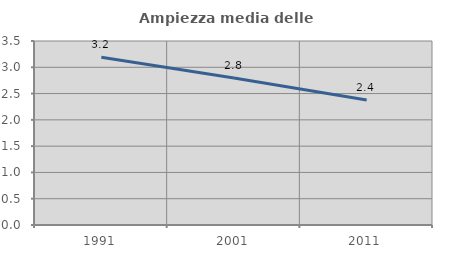
| Category | Ampiezza media delle famiglie |
|---|---|
| 1991.0 | 3.191 |
| 2001.0 | 2.796 |
| 2011.0 | 2.379 |